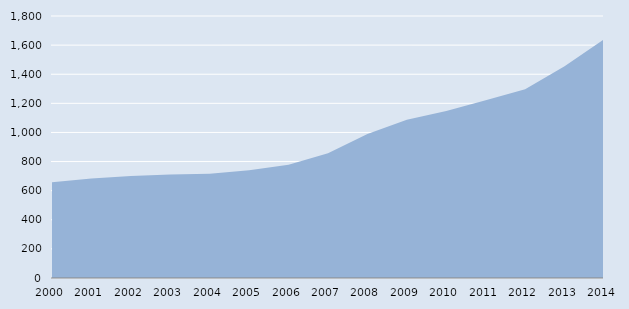
| Category | Series 0 |
|---|---|
| 2000.0 | 657 |
| 2001.0 | 683 |
| 2002.0 | 701 |
| 2003.0 | 711 |
| 2004.0 | 716 |
| 2005.0 | 740 |
| 2006.0 | 778 |
| 2007.0 | 857 |
| 2008.0 | 989 |
| 2009.0 | 1088 |
| 2010.0 | 1148 |
| 2011.0 | 1221 |
| 2012.0 | 1296 |
| 2013.0 | 1455 |
| 2014.0 | 1640 |